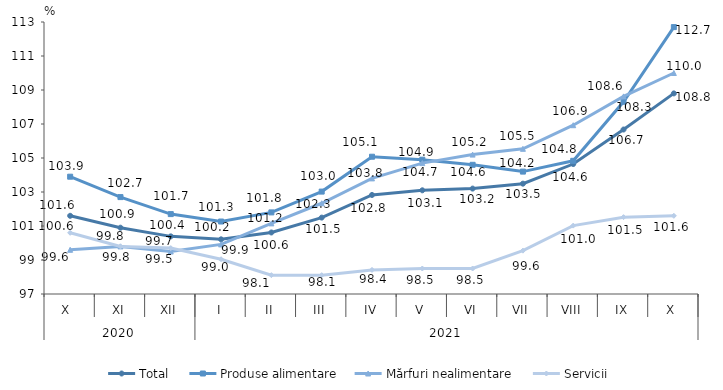
| Category | Total  | Produse alimentare | Mărfuri nealimentare  | Servicii |
|---|---|---|---|---|
| 0 | 101.6 | 103.9 | 99.6 | 100.6 |
| 1 | 100.9 | 102.7 | 99.8 | 99.8 |
| 2 | 100.39 | 101.7 | 99.5 | 99.7 |
| 3 | 100.216 | 101.263 | 99.917 | 99.046 |
| 4 | 100.619 | 101.8 | 101.154 | 98.109 |
| 5 | 101.493 | 103.024 | 102.337 | 98.107 |
| 6 | 102.826 | 105.075 | 103.801 | 98.417 |
| 7 | 103.1 | 104.9 | 104.7 | 98.5 |
| 8 | 103.2 | 104.6 | 105.2 | 98.5 |
| 9 | 103.49 | 104.2 | 105.54 | 99.55 |
| 10 | 104.645 | 104.834 | 106.928 | 101.023 |
| 11 | 106.675 | 108.308 | 108.624 | 101.521 |
| 12 | 108.8 | 112.7 | 110 | 101.6 |